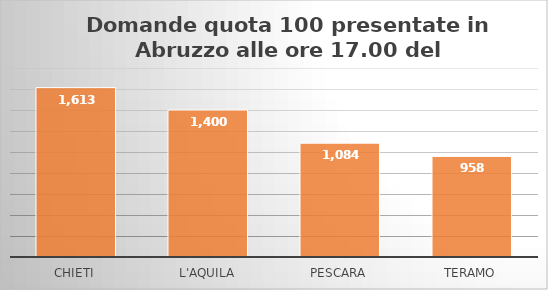
| Category | Series 0 |
|---|---|
| CHIETI | 1613 |
| L'AQUILA | 1400 |
| PESCARA | 1084 |
| TERAMO | 958 |